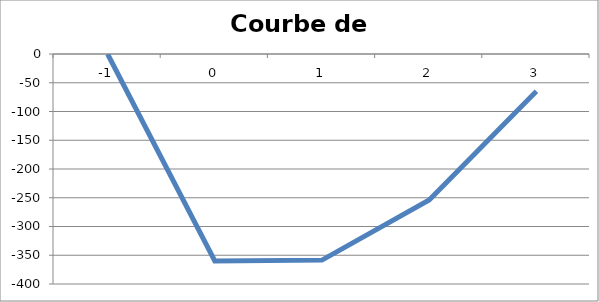
| Category | Courbe de cash |
|---|---|
| -1.0 | 0 |
| 0.0 | -360 |
| 1.0 | -358.485 |
| 2.0 | -253.802 |
| 3.0 | -64.721 |